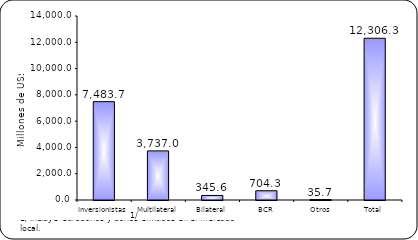
| Category | Series 1 |
|---|---|
| Inversionistas | 7483.7 |
| Multilateral | 3737 |
| Bilateral | 345.6 |
| BCR | 704.3 |
| Otros | 35.7 |
| Total | 12306.3 |